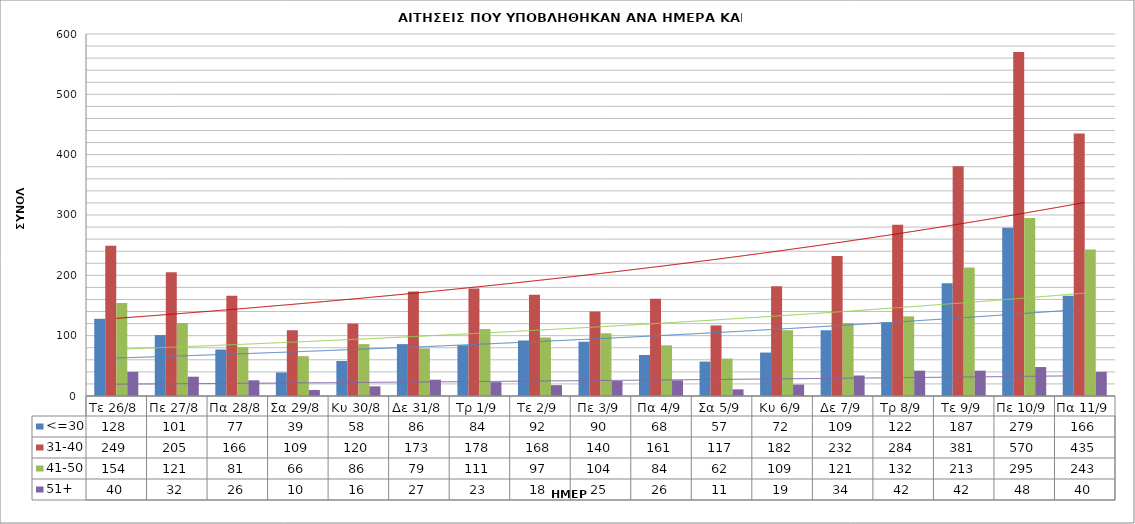
| Category | <=30 | 31-40 | 41-50 | 51+ |
|---|---|---|---|---|
| Τε 26/8 | 128 | 249 | 154 | 40 |
| Πε 27/8 | 101 | 205 | 121 | 32 |
| Πα 28/8 | 77 | 166 | 81 | 26 |
| Σα 29/8 | 39 | 109 | 66 | 10 |
| Κυ 30/8 | 58 | 120 | 86 | 16 |
| Δε 31/8 | 86 | 173 | 79 | 27 |
| Τρ 1/9 | 84 | 178 | 111 | 23 |
| Τε 2/9 | 92 | 168 | 97 | 18 |
| Πε 3/9 | 90 | 140 | 104 | 25 |
| Πα 4/9 | 68 | 161 | 84 | 26 |
| Σα 5/9 | 57 | 117 | 62 | 11 |
| Κυ 6/9 | 72 | 182 | 109 | 19 |
| Δε 7/9 | 109 | 232 | 121 | 34 |
| Τρ 8/9 | 122 | 284 | 132 | 42 |
| Τε 9/9 | 187 | 381 | 213 | 42 |
| Πε 10/9 | 279 | 570 | 295 | 48 |
| Πα 11/9 | 166 | 435 | 243 | 40 |